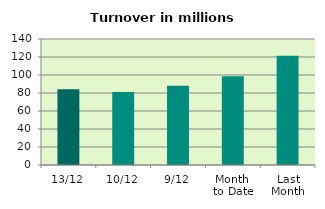
| Category | Series 0 |
|---|---|
| 13/12 | 84.193 |
| 10/12 | 80.98 |
| 9/12 | 88.111 |
| Month 
to Date | 98.593 |
| Last
Month | 121.455 |